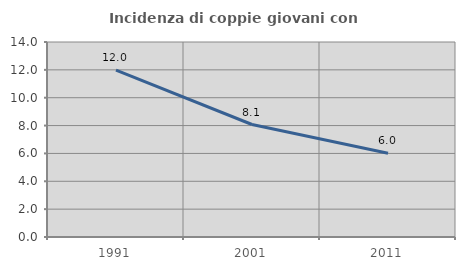
| Category | Incidenza di coppie giovani con figli |
|---|---|
| 1991.0 | 11.98 |
| 2001.0 | 8.076 |
| 2011.0 | 6.009 |